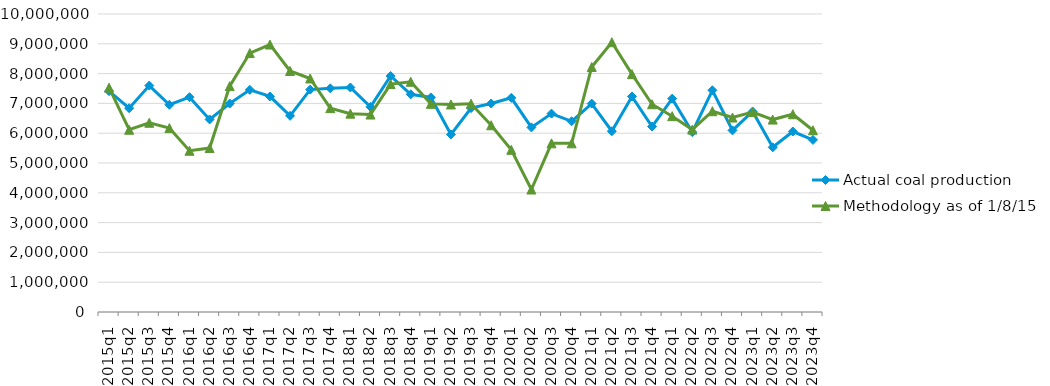
| Category | Actual coal production | Methodology as of 1/8/15 |
|---|---|---|
| 2015q1 | 7410661 | 7528714 |
| 2015q2 | 6838846 | 6115700 |
| 2015q3 | 7598245 | 6350094 |
| 2015q4 | 6954074 | 6171416 |
| 2016q1 | 7209052 | 5410882 |
| 2016q2 | 6462448 | 5501628 |
| 2016q3 | 6994670 | 7579001 |
| 2016q4 | 7454689 | 8688200 |
| 2017q1 | 7234009 | 8974940 |
| 2017q2 | 6583966 | 8088832 |
| 2017q3 | 7463199 | 7836127 |
| 2017q4 | 7506331 | 6841347 |
| 2018q1 | 7533237 | 6655363 |
| 2018q2 | 6884116 | 6625923 |
| 2018q3 | 7920624 | 7648933 |
| 2018q4 | 7305453 | 7725924 |
| 2019q1 | 7200405 | 6984126 |
| 2019q2 | 5958305 | 6964411 |
| 2019q3 | 6842084 | 6990718 |
| 2019q4 | 6996066 | 6266072 |
| 2020q1 | 7186210 | 5442202 |
| 2020q2 | 6195444 | 4110406 |
| 2020q3 | 6657054 | 5659736 |
| 2020q4 | 6399484 | 5659736 |
| 2021q1 | 6992819 | 8221822 |
| 2021q2 | 6065508 | 9053081 |
| 2021q3 | 7232500 | 7981613 |
| 2021q4 | 6221781 | 6971212 |
| 2022q1 | 7160656 | 6571115 |
| 2022q2 | 6036593 | 6120318 |
| 2022q3 | 7440078 | 6737209 |
| 2022q4 | 6093299 | 6525439 |
| 2023q1 | 6728318 | 6710419 |
| 2023q2 | 5526874 | 6457441 |
| 2023q3 | 6056907 | 6636133 |
| 2023q4 | 5775106 | 6098788 |